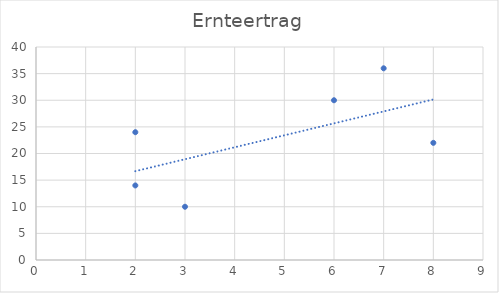
| Category | Ernteertrag |
|---|---|
| 6.0 | 30 |
| 3.0 | 10 |
| 8.0 | 22 |
| 2.0 | 14 |
| 7.0 | 36 |
| 2.0 | 24 |